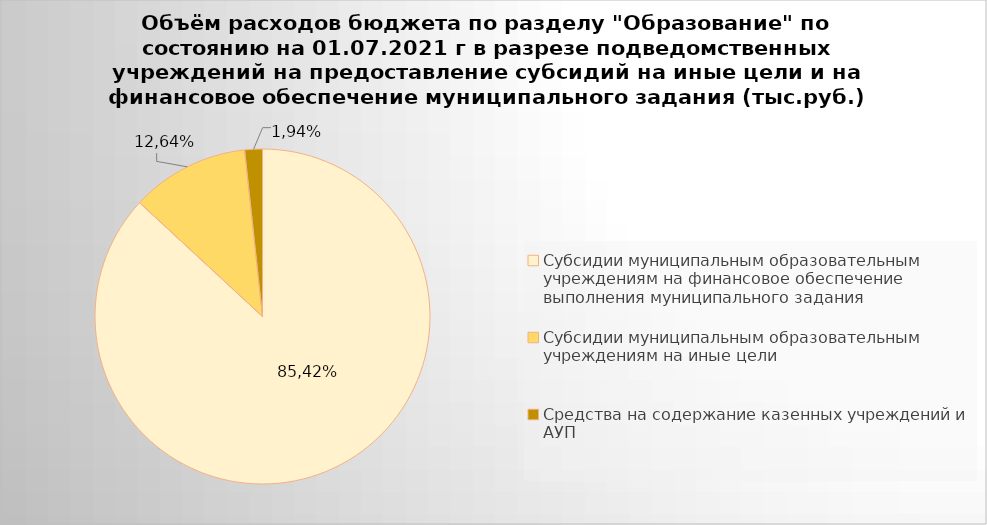
| Category | Series 0 |
|---|---|
| Субсидии муниципальным образовательным учреждениям на финансовое обеспечение выполнения муниципального задания | 5178627.77 |
| Субсидии муниципальным образовательным учреждениям на иные цели | 679999.78 |
| Средства на содержание казенных учреждений и АУП | 101574.31 |